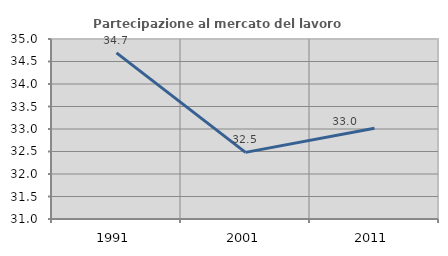
| Category | Partecipazione al mercato del lavoro  femminile |
|---|---|
| 1991.0 | 34.692 |
| 2001.0 | 32.481 |
| 2011.0 | 33.018 |